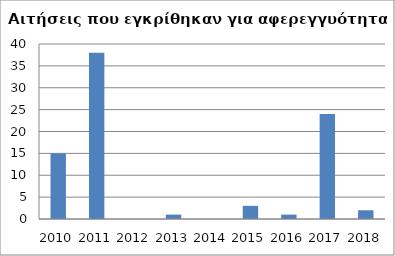
| Category | Series 0 |
|---|---|
| 2010.0 | 15 |
| 2011.0 | 38 |
| 2012.0 | 0 |
| 2013.0 | 1 |
| 2014.0 | 0 |
| 2015.0 | 3 |
| 2016.0 | 1 |
| 2017.0 | 24 |
| 2018.0 | 2 |